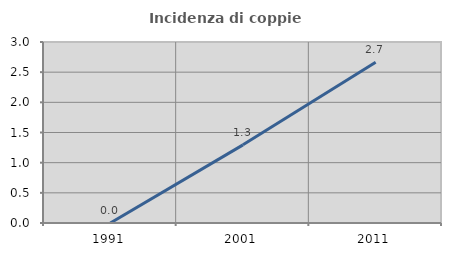
| Category | Incidenza di coppie miste |
|---|---|
| 1991.0 | 0 |
| 2001.0 | 1.295 |
| 2011.0 | 2.663 |